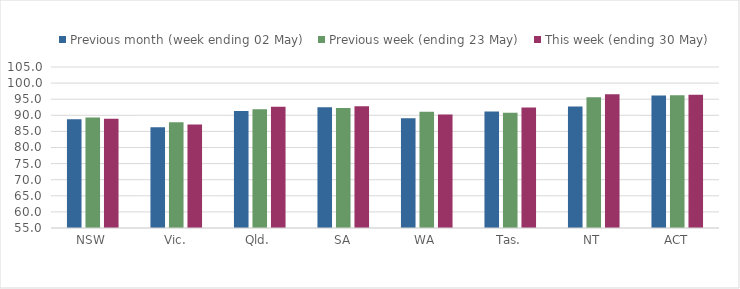
| Category | Previous month (week ending 02 May) | Previous week (ending 23 May) | This week (ending 30 May) |
|---|---|---|---|
| NSW | 88.737 | 89.291 | 88.937 |
| Vic. | 86.283 | 87.825 | 87.116 |
| Qld. | 91.305 | 91.872 | 92.677 |
| SA | 92.487 | 92.237 | 92.843 |
| WA | 89.058 | 91.1 | 90.248 |
| Tas. | 91.148 | 90.813 | 92.395 |
| NT | 92.72 | 95.614 | 96.526 |
| ACT | 96.182 | 96.229 | 96.383 |